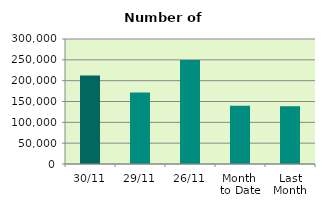
| Category | Series 0 |
|---|---|
| 30/11 | 212338 |
| 29/11 | 171692 |
| 26/11 | 249696 |
| Month 
to Date | 139642.182 |
| Last
Month | 138693.238 |